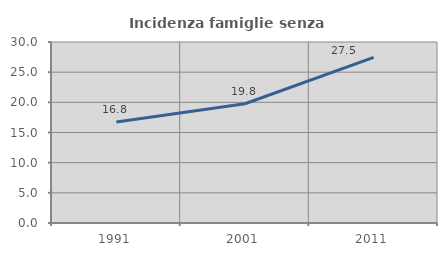
| Category | Incidenza famiglie senza nuclei |
|---|---|
| 1991.0 | 16.751 |
| 2001.0 | 19.764 |
| 2011.0 | 27.46 |